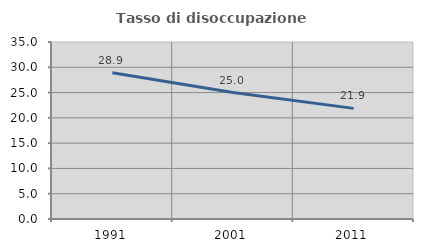
| Category | Tasso di disoccupazione giovanile  |
|---|---|
| 1991.0 | 28.916 |
| 2001.0 | 25 |
| 2011.0 | 21.875 |